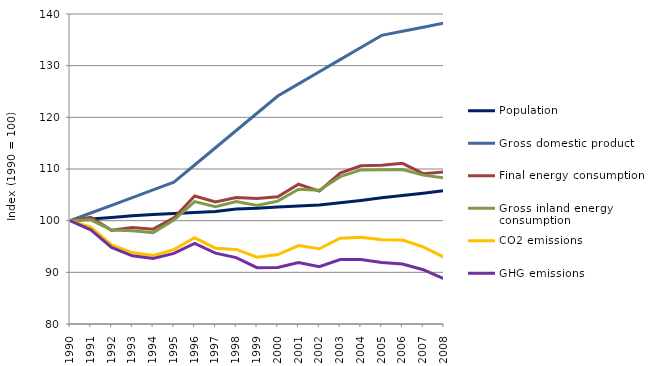
| Category | Population | Gross domestic product | Final energy consumption | Gross inland energy consumption | CO2 emissions | GHG emissions |
|---|---|---|---|---|---|---|
| 1990.0 | 100 | 100 | 100 | 100 | 100 | 100 |
| 1991.0 | 100.336 | 101.488 | 100.626 | 100.157 | 98.733 | 98.214 |
| 1992.0 | 100.607 | 102.976 | 98.131 | 98.172 | 95.314 | 94.812 |
| 1993.0 | 100.954 | 104.464 | 98.692 | 98.054 | 93.826 | 93.203 |
| 1994.0 | 101.207 | 105.952 | 98.358 | 97.676 | 93.271 | 92.67 |
| 1995.0 | 101.408 | 107.439 | 100.534 | 100.124 | 94.396 | 93.671 |
| 1996.0 | 101.588 | 110.777 | 104.768 | 103.68 | 96.684 | 95.586 |
| 1997.0 | 101.752 | 114.114 | 103.635 | 102.716 | 94.669 | 93.715 |
| 1998.0 | 102.239 | 117.451 | 104.482 | 103.693 | 94.442 | 92.851 |
| 1999.0 | 102.387 | 120.789 | 104.279 | 102.958 | 92.944 | 90.895 |
| 2000.0 | 102.632 | 124.126 | 104.64 | 103.784 | 93.434 | 90.934 |
| 2001.0 | 102.851 | 126.474 | 107.051 | 106.101 | 95.189 | 91.916 |
| 2002.0 | 103.029 | 128.822 | 105.731 | 105.884 | 94.563 | 91.105 |
| 2003.0 | 103.457 | 131.17 | 109.194 | 108.519 | 96.598 | 92.486 |
| 2004.0 | 103.914 | 133.518 | 110.631 | 109.824 | 96.772 | 92.481 |
| 2005.0 | 104.415 | 135.866 | 110.744 | 109.863 | 96.322 | 91.911 |
| 2006.0 | 104.855 | 136.658 | 111.093 | 109.894 | 96.257 | 91.608 |
| 2007.0 | 105.297 | 137.45 | 109.098 | 108.813 | 94.935 | 90.511 |
| 2008.0 | 105.795 | 138.242 | 109.454 | 108.302 | 92.913 | 88.732 |